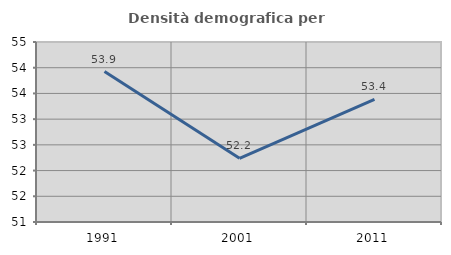
| Category | Densità demografica |
|---|---|
| 1991.0 | 53.925 |
| 2001.0 | 52.239 |
| 2011.0 | 53.385 |